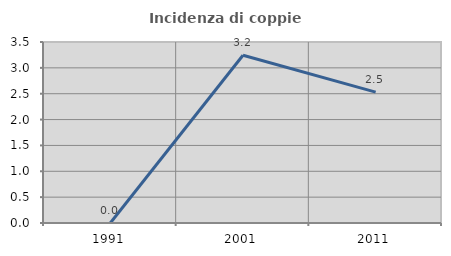
| Category | Incidenza di coppie miste |
|---|---|
| 1991.0 | 0 |
| 2001.0 | 3.243 |
| 2011.0 | 2.532 |